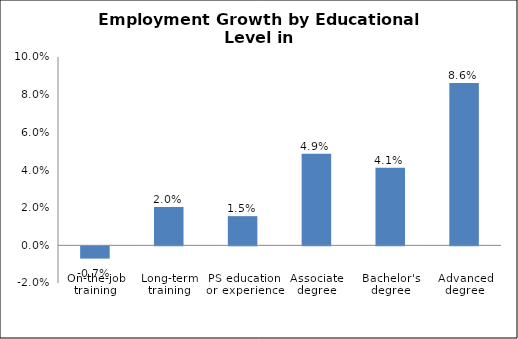
| Category | Series 0 |
|---|---|
| On-the-job training | -0.007 |
| Long-term training | 0.02 |
| PS education or experience | 0.015 |
| Associate degree | 0.049 |
| Bachelor's degree | 0.041 |
| Advanced degree | 0.086 |